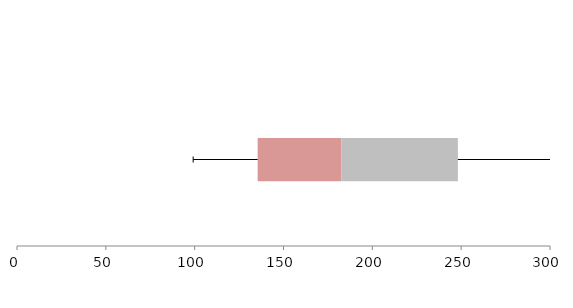
| Category | Series 1 | Series 2 | Series 3 |
|---|---|---|---|
| 0 | 135.461 | 47.108 | 65.585 |